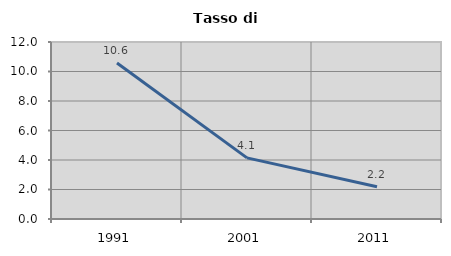
| Category | Tasso di disoccupazione   |
|---|---|
| 1991.0 | 10.573 |
| 2001.0 | 4.145 |
| 2011.0 | 2.186 |